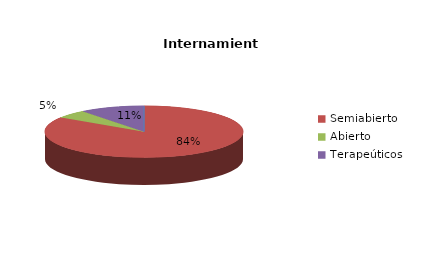
| Category | Series 0 |
|---|---|
| Cerrado | 0 |
| Semiabierto | 16 |
| Abierto | 1 |
| Terapeúticos | 2 |